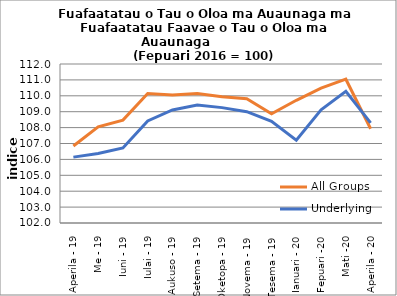
| Category | All Groups | Underlying |
|---|---|---|
| Aperila - 19 | 106.842 | 106.143 |
| Me - 19 | 108.044 | 106.37 |
| Iuni - 19 | 108.473 | 106.721 |
| Iulai - 19 | 110.146 | 108.423 |
| Aukuso - 19 | 110.057 | 109.11 |
| Setema - 19 | 110.148 | 109.423 |
| Oketopa - 19 | 109.943 | 109.256 |
| Novema - 19 | 109.811 | 108.998 |
| Tesema - 19 | 108.864 | 108.4 |
| Ianuari - 20 | 109.718 | 107.211 |
| Fepuari -20 | 110.483 | 109.121 |
| Mati -20 | 111.043 | 110.276 |
| Aperila - 20 | 107.93 | 108.297 |